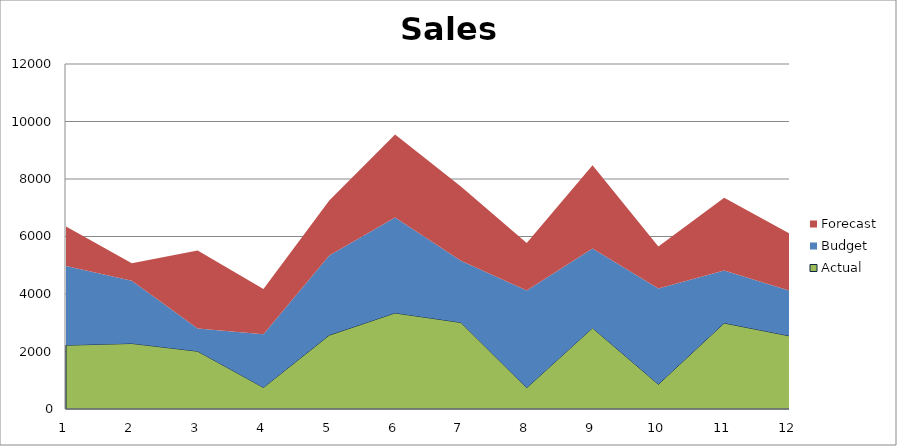
| Category | Actual | Budget | Forecast |
|---|---|---|---|
| 0 | 2220 | 2750 | 1380 |
| 1 | 2280 | 2180 | 610 |
| 2 | 2010 | 790 | 2710 |
| 3 | 750 | 1850 | 1570 |
| 4 | 2570 | 2770 | 1910 |
| 5 | 3340 | 3320 | 2890 |
| 6 | 3010 | 2150 | 2580 |
| 7 | 740 | 3380 | 1650 |
| 8 | 2820 | 2760 | 2900 |
| 9 | 860 | 3330 | 1460 |
| 10 | 2990 | 1830 | 2530 |
| 11 | 2540 | 1570 | 1980 |